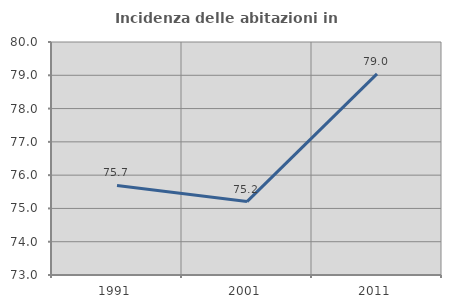
| Category | Incidenza delle abitazioni in proprietà  |
|---|---|
| 1991.0 | 75.691 |
| 2001.0 | 75.205 |
| 2011.0 | 79.041 |